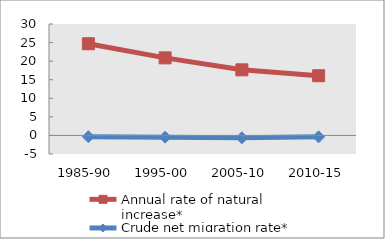
| Category | Annual rate of natural increase* | Crude net migration rate* |
|---|---|---|
| 1985-90 | 24.686 | -0.342 |
| 1995-00 | 20.88 | -0.464 |
| 2005-10 | 17.658 | -0.646 |
| 2010-15 | 16.071 | -0.384 |